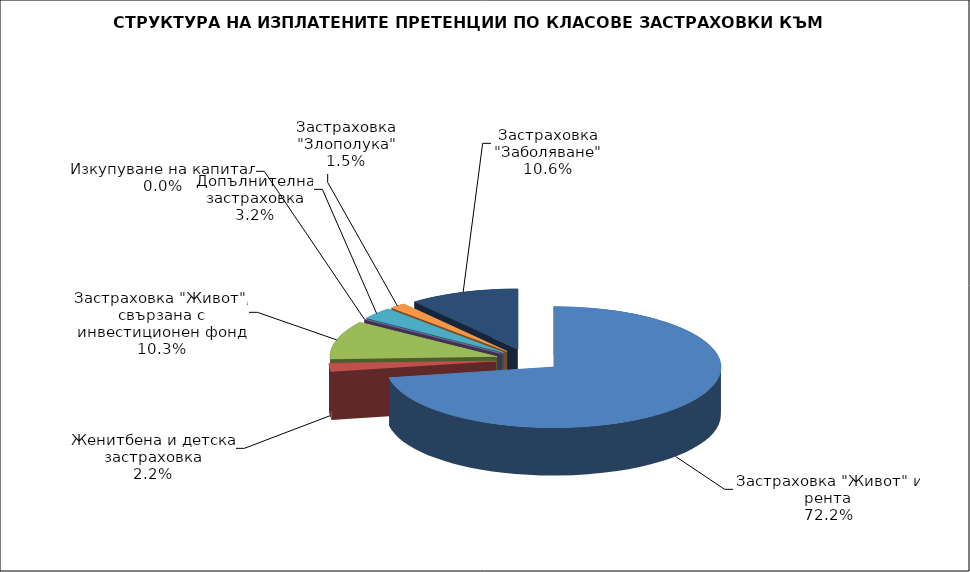
| Category | 36 949 389 1 139 632 5 259 396 0 1 631 252 785 881 5 437 456 |
|---|---|
| Застраховка "Живот" и рента | 36949389.221 |
| Женитбена и детска застраховка | 1139631.65 |
| Застраховка "Живот", свързана с инвестиционен фонд | 5259396.13 |
| Изкупуване на капитал | 0 |
| Допълнителна застраховка | 1631252.44 |
| Застраховка "Злополука" | 785881.04 |
| Застраховка "Заболяване" | 5437456.22 |